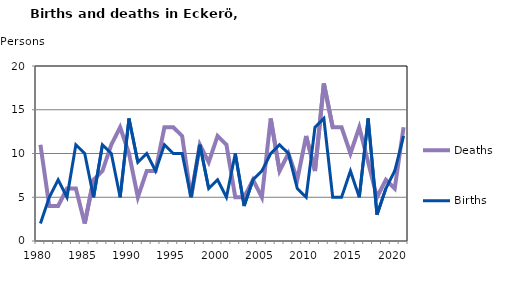
| Category | Deaths | Births |
|---|---|---|
| 1980.0 | 11 | 2 |
| 1981.0 | 4 | 5 |
| 1982.0 | 4 | 7 |
| 1983.0 | 6 | 5 |
| 1984.0 | 6 | 11 |
| 1985.0 | 2 | 10 |
| 1986.0 | 7 | 5 |
| 1987.0 | 8 | 11 |
| 1988.0 | 11 | 10 |
| 1989.0 | 13 | 5 |
| 1990.0 | 10 | 14 |
| 1991.0 | 5 | 9 |
| 1992.0 | 8 | 10 |
| 1993.0 | 8 | 8 |
| 1994.0 | 13 | 11 |
| 1995.0 | 13 | 10 |
| 1996.0 | 12 | 10 |
| 1997.0 | 5 | 5 |
| 1998.0 | 11 | 11 |
| 1999.0 | 9 | 6 |
| 2000.0 | 12 | 7 |
| 2001.0 | 11 | 5 |
| 2002.0 | 5 | 10 |
| 2003.0 | 5 | 4 |
| 2004.0 | 7 | 7 |
| 2005.0 | 5 | 8 |
| 2006.0 | 14 | 10 |
| 2007.0 | 8 | 11 |
| 2008.0 | 10 | 10 |
| 2009.0 | 7 | 6 |
| 2010.0 | 12 | 5 |
| 2011.0 | 8 | 13 |
| 2012.0 | 18 | 14 |
| 2013.0 | 13 | 5 |
| 2014.0 | 13 | 5 |
| 2015.0 | 10 | 8 |
| 2016.0 | 13 | 5 |
| 2017.0 | 9 | 14 |
| 2018.0 | 5 | 3 |
| 2019.0 | 7 | 6 |
| 2020.0 | 6 | 8 |
| 2021.0 | 13 | 12 |